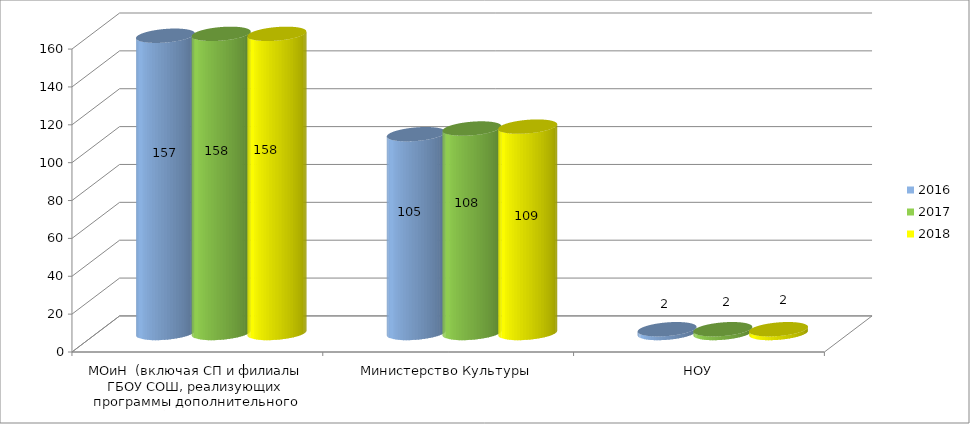
| Category | 2016 | 2017 | 2018 |
|---|---|---|---|
| МОиН  (включая СП и филиалы ГБОУ СОШ, реализующих программы дополнительного образования) | 157 | 158 | 158 |
| Министерство Культуры | 105 | 108 | 109 |
| НОУ | 2 | 2 | 2 |